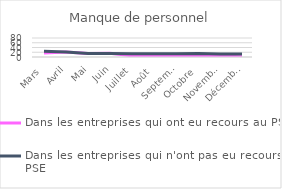
| Category | Dans les entreprises qui ont eu recours au PSE  | Dans les entreprises qui n'ont pas eu recours au PSE  |
|---|---|---|
| Mars | 16.451 | 24.036 |
| Avril | 21.315 | 21.519 |
| Mai | 14.643 | 14.245 |
| Juin | 16.073 | 14.297 |
| Juillet | 5.129 | 13.269 |
| Août | 4.818 | 14.082 |
| Septembre | 4.344 | 14.154 |
| Octobre | 4.935 | 15.026 |
| Novembre | 4.069 | 12.452 |
| Décembre | 1.075 | 12.275 |